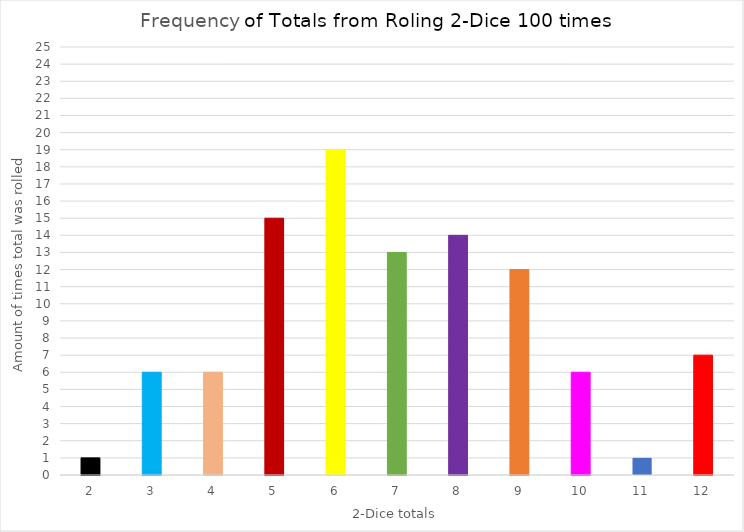
| Category | Frequency |
|---|---|
| 2.0 | 1 |
| 3.0 | 6 |
| 4.0 | 6 |
| 5.0 | 15 |
| 6.0 | 19 |
| 7.0 | 13 |
| 8.0 | 14 |
| 9.0 | 12 |
| 10.0 | 6 |
| 11.0 | 1 |
| 12.0 | 7 |